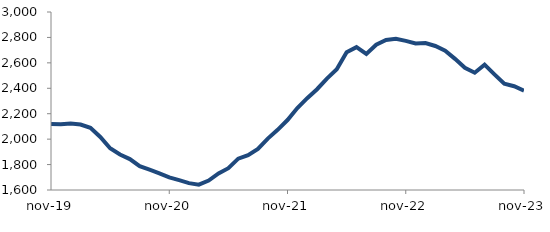
| Category | Series 0 |
|---|---|
| 2019-11-01 | 2119.211 |
| 2019-12-01 | 2116.27 |
| 2020-01-01 | 2123.179 |
| 2020-02-01 | 2115.217 |
| 2020-03-01 | 2088.6 |
| 2020-04-01 | 2017.241 |
| 2020-05-01 | 1928.116 |
| 2020-06-01 | 1878.979 |
| 2020-07-01 | 1843.29 |
| 2020-08-01 | 1787.543 |
| 2020-09-01 | 1760.281 |
| 2020-10-01 | 1731.197 |
| 2020-11-01 | 1698.835 |
| 2020-12-01 | 1677.184 |
| 2021-01-01 | 1654.072 |
| 2021-02-01 | 1641.869 |
| 2021-03-01 | 1673.821 |
| 2021-04-01 | 1730.759 |
| 2021-05-01 | 1771.425 |
| 2021-06-01 | 1846.573 |
| 2021-07-01 | 1874.111 |
| 2021-08-01 | 1922.894 |
| 2021-09-01 | 2004.225 |
| 2021-10-01 | 2073.331 |
| 2021-11-01 | 2150.314 |
| 2021-12-01 | 2244.492 |
| 2022-01-01 | 2321.95 |
| 2022-02-01 | 2392.65 |
| 2022-03-01 | 2476.383 |
| 2022-04-01 | 2549.069 |
| 2022-05-01 | 2683.336 |
| 2022-06-01 | 2723.868 |
| 2022-07-01 | 2670.585 |
| 2022-08-01 | 2742.913 |
| 2022-09-01 | 2780.46 |
| 2022-10-01 | 2788.916 |
| 2022-11-01 | 2772.628 |
| 2022-12-01 | 2752.307 |
| 2023-01-01 | 2755.69 |
| 2023-02-01 | 2732.653 |
| 2023-03-01 | 2696.107 |
| 2023-04-01 | 2631.454 |
| 2023-05-01 | 2561.826 |
| 2023-06-01 | 2522.703 |
| 2023-07-01 | 2586.296 |
| 2023-08-01 | 2509.777 |
| 2023-09-01 | 2436.109 |
| 2023-10-01 | 2416.11 |
| 2023-11-01 | 2381.816 |